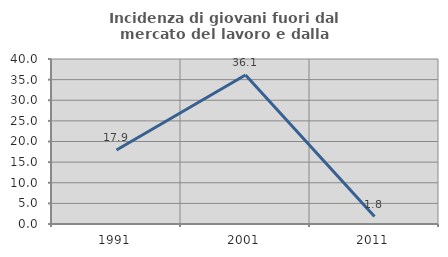
| Category | Incidenza di giovani fuori dal mercato del lavoro e dalla formazione  |
|---|---|
| 1991.0 | 17.925 |
| 2001.0 | 36.111 |
| 2011.0 | 1.818 |